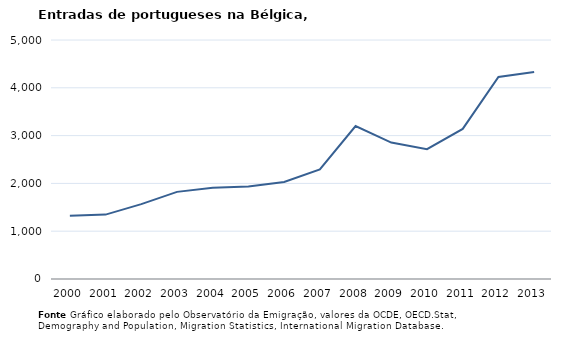
| Category | Entradas |
|---|---|
| 2000.0 | 1324 |
| 2001.0 | 1347 |
| 2002.0 | 1567 |
| 2003.0 | 1823 |
| 2004.0 | 1907 |
| 2005.0 | 1934 |
| 2006.0 | 2030 |
| 2007.0 | 2293 |
| 2008.0 | 3200 |
| 2009.0 | 2854 |
| 2010.0 | 2717 |
| 2011.0 | 3140 |
| 2012.0 | 4227 |
| 2013.0 | 4332 |